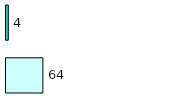
| Category | Series 0 | Series 1 |
|---|---|---|
| 0 | 64 | 4 |